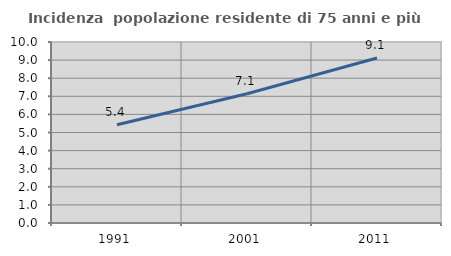
| Category | Incidenza  popolazione residente di 75 anni e più |
|---|---|
| 1991.0 | 5.43 |
| 2001.0 | 7.142 |
| 2011.0 | 9.117 |